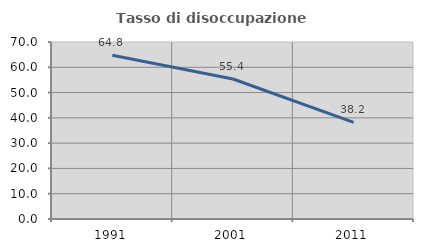
| Category | Tasso di disoccupazione giovanile  |
|---|---|
| 1991.0 | 64.773 |
| 2001.0 | 55.357 |
| 2011.0 | 38.182 |